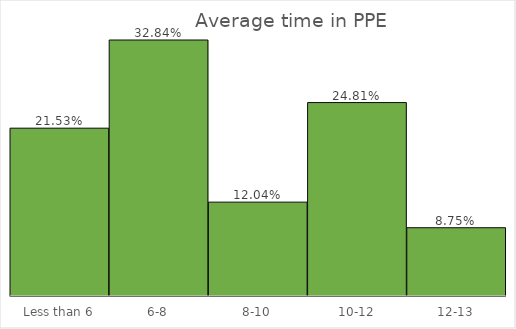
| Category | Participant N⁰ |
|---|---|
| Less than 6 | 59 |
| 6-8 | 90 |
| 8-10 | 33 |
| 10-12 | 68 |
| 12-13 | 24 |